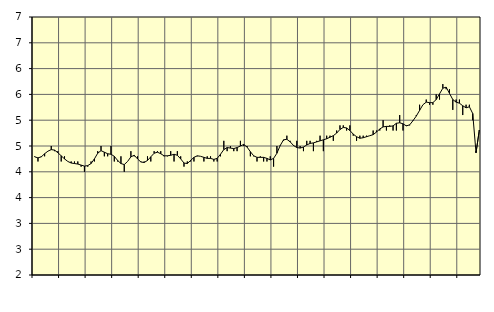
| Category | Piggar | Personliga och kulturella tjänster, SNI 90-98 |
|---|---|---|
| nan | 4.3 | 4.29 |
| 87.0 | 4.2 | 4.27 |
| 87.0 | 4.3 | 4.29 |
| 87.0 | 4.3 | 4.35 |
| nan | 4.4 | 4.4 |
| 88.0 | 4.5 | 4.43 |
| 88.0 | 4.4 | 4.42 |
| 88.0 | 4.4 | 4.37 |
| nan | 4.2 | 4.31 |
| 89.0 | 4.3 | 4.25 |
| 89.0 | 4.2 | 4.2 |
| 89.0 | 4.2 | 4.17 |
| nan | 4.2 | 4.16 |
| 90.0 | 4.2 | 4.15 |
| 90.0 | 4.1 | 4.13 |
| 90.0 | 4 | 4.11 |
| nan | 4.1 | 4.12 |
| 91.0 | 4.2 | 4.16 |
| 91.0 | 4.2 | 4.25 |
| 91.0 | 4.4 | 4.36 |
| nan | 4.5 | 4.41 |
| 92.0 | 4.3 | 4.38 |
| 92.0 | 4.3 | 4.35 |
| 92.0 | 4.5 | 4.34 |
| nan | 4.2 | 4.3 |
| 93.0 | 4.2 | 4.22 |
| 93.0 | 4.3 | 4.16 |
| 93.0 | 4 | 4.14 |
| nan | 4.2 | 4.2 |
| 94.0 | 4.4 | 4.29 |
| 94.0 | 4.3 | 4.32 |
| 94.0 | 4.3 | 4.25 |
| nan | 4.2 | 4.19 |
| 95.0 | 4.2 | 4.18 |
| 95.0 | 4.3 | 4.22 |
| 95.0 | 4.2 | 4.29 |
| nan | 4.4 | 4.36 |
| 96.0 | 4.4 | 4.38 |
| 96.0 | 4.4 | 4.35 |
| 96.0 | 4.3 | 4.31 |
| nan | 4.3 | 4.31 |
| 97.0 | 4.4 | 4.32 |
| 97.0 | 4.2 | 4.34 |
| 97.0 | 4.4 | 4.32 |
| nan | 4.3 | 4.25 |
| 98.0 | 4.1 | 4.17 |
| 98.0 | 4.2 | 4.16 |
| 98.0 | 4.2 | 4.22 |
| nan | 4.2 | 4.28 |
| 99.0 | 4.3 | 4.31 |
| 99.0 | 4.3 | 4.3 |
| 99.0 | 4.2 | 4.28 |
| nan | 4.3 | 4.26 |
| 0.0 | 4.3 | 4.26 |
| 0.0 | 4.2 | 4.24 |
| 0.0 | 4.2 | 4.26 |
| nan | 4.3 | 4.34 |
| 1.0 | 4.6 | 4.43 |
| 1.0 | 4.4 | 4.47 |
| 1.0 | 4.5 | 4.46 |
| nan | 4.4 | 4.45 |
| 2.0 | 4.4 | 4.47 |
| 2.0 | 4.6 | 4.5 |
| 2.0 | 4.5 | 4.53 |
| nan | 4.5 | 4.48 |
| 3.0 | 4.3 | 4.39 |
| 3.0 | 4.3 | 4.31 |
| 3.0 | 4.2 | 4.28 |
| nan | 4.3 | 4.28 |
| 4.0 | 4.2 | 4.28 |
| 4.0 | 4.2 | 4.26 |
| 4.0 | 4.3 | 4.23 |
| nan | 4.1 | 4.26 |
| 5.0 | 4.5 | 4.36 |
| 5.0 | 4.5 | 4.51 |
| 5.0 | 4.6 | 4.62 |
| nan | 4.7 | 4.63 |
| 6.0 | 4.6 | 4.58 |
| 6.0 | 4.5 | 4.51 |
| 6.0 | 4.6 | 4.47 |
| nan | 4.5 | 4.46 |
| 7.0 | 4.4 | 4.48 |
| 7.0 | 4.6 | 4.52 |
| 7.0 | 4.6 | 4.55 |
| nan | 4.4 | 4.56 |
| 8.0 | 4.6 | 4.58 |
| 8.0 | 4.7 | 4.6 |
| 8.0 | 4.4 | 4.62 |
| nan | 4.7 | 4.64 |
| 9.0 | 4.7 | 4.67 |
| 9.0 | 4.6 | 4.7 |
| 9.0 | 4.8 | 4.75 |
| nan | 4.9 | 4.82 |
| 10.0 | 4.9 | 4.86 |
| 10.0 | 4.8 | 4.85 |
| 10.0 | 4.9 | 4.8 |
| nan | 4.7 | 4.73 |
| 11.0 | 4.6 | 4.68 |
| 11.0 | 4.7 | 4.65 |
| 11.0 | 4.7 | 4.66 |
| nan | 4.7 | 4.68 |
| 12.0 | 4.7 | 4.7 |
| 12.0 | 4.8 | 4.72 |
| 12.0 | 4.8 | 4.77 |
| nan | 4.8 | 4.83 |
| 13.0 | 5 | 4.87 |
| 13.0 | 4.8 | 4.88 |
| 13.0 | 4.9 | 4.88 |
| nan | 4.8 | 4.89 |
| 14.0 | 4.8 | 4.94 |
| 14.0 | 5.1 | 4.95 |
| 14.0 | 4.8 | 4.93 |
| nan | 4.9 | 4.89 |
| 15.0 | 4.9 | 4.91 |
| 15.0 | 5 | 4.99 |
| 15.0 | 5.1 | 5.08 |
| nan | 5.3 | 5.19 |
| 16.0 | 5.3 | 5.3 |
| 16.0 | 5.4 | 5.35 |
| 16.0 | 5.3 | 5.34 |
| nan | 5.3 | 5.34 |
| 17.0 | 5.5 | 5.4 |
| 17.0 | 5.4 | 5.51 |
| 17.0 | 5.7 | 5.62 |
| nan | 5.6 | 5.64 |
| 18.0 | 5.6 | 5.52 |
| 18.0 | 5.2 | 5.4 |
| 18.0 | 5.4 | 5.35 |
| nan | 5.4 | 5.33 |
| 19.0 | 5.1 | 5.28 |
| 19.0 | 5.3 | 5.24 |
| 19.0 | 5.3 | 5.26 |
| nan | 5 | 5.13 |
| 20.0 | 4.4 | 4.37 |
| 20.0 | 4.8 | 4.81 |